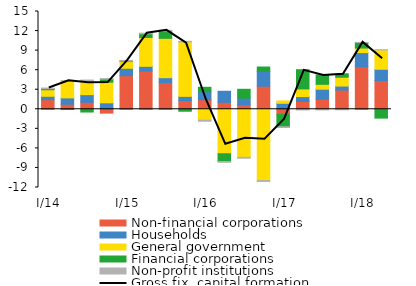
| Category | Non-financial corporations | Households | General government | Financial corporations | Non-profit institutions |
|---|---|---|---|---|---|
|  I/14 | 1.474 | 0.519 | 1.003 | 0.167 | 0.094 |
| II | 0.773 | 0.974 | 2.563 | -0.019 | 0.075 |
| III | 1.067 | 1.179 | 2.15 | -0.423 | 0.085 |
|  IV | -0.592 | 0.988 | 3.169 | 0.468 | 0.068 |
|  I/15 | 5.151 | 1.14 | 1.03 | 0.066 | 0.118 |
| II | 5.861 | 0.727 | 4.433 | 0.558 | 0.099 |
| III | 4.099 | 0.748 | 6.039 | 1.126 | 0.101 |
| IV | 1.35 | 0.631 | 8.349 | -0.301 | 0.098 |
|  I/16 | 1.462 | 1.228 | -1.675 | 0.684 | -0.158 |
| II | 1.064 | 1.7 | -6.82 | -1.194 | -0.123 |
| III | 0.703 | 1.012 | -7.369 | 1.351 | -0.141 |
| IV | 3.53 | 2.292 | -10.936 | 0.661 | -0.135 |
|  I/17 | -0.785 | 0.918 | 0.36 | -1.899 | -0.113 |
| II | 1.196 | 0.75 | 1.18 | 2.944 | -0.099 |
| III | 1.54 | 1.54 | 0.749 | 1.431 | -0.09 |
| IV | 2.947 | 0.614 | 1.354 | 0.538 | -0.077 |
|  I/18 | 6.527 | 2.167 | 0.695 | 0.857 | 0.017 |
| II | 4.405 | 1.734 | 2.963 | -1.356 | 0.015 |